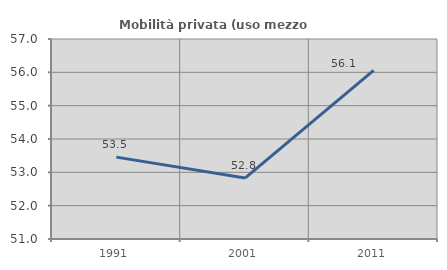
| Category | Mobilità privata (uso mezzo privato) |
|---|---|
| 1991.0 | 53.456 |
| 2001.0 | 52.828 |
| 2011.0 | 56.061 |